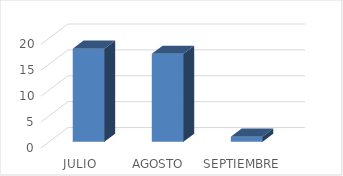
| Category | Series 0 |
|---|---|
| JULIO | 18 |
| AGOSTO | 17 |
| SEPTIEMBRE | 1 |